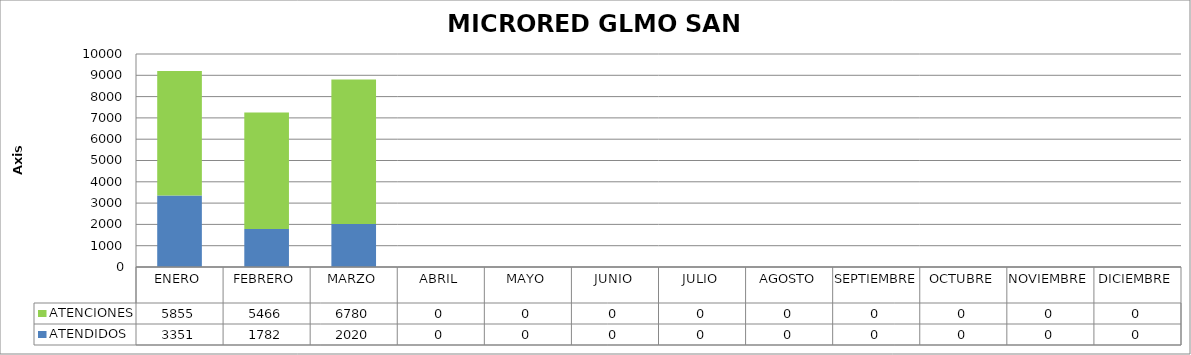
| Category | ATENDIDOS | ATENCIONES |
|---|---|---|
| ENERO | 3351 | 5855 |
| FEBRERO | 1782 | 5466 |
| MARZO | 2020 | 6780 |
| ABRIL | 0 | 0 |
| MAYO | 0 | 0 |
| JUNIO | 0 | 0 |
| JULIO | 0 | 0 |
| AGOSTO | 0 | 0 |
| SEPTIEMBRE | 0 | 0 |
| OCTUBRE | 0 | 0 |
| NOVIEMBRE | 0 | 0 |
| DICIEMBRE | 0 | 0 |